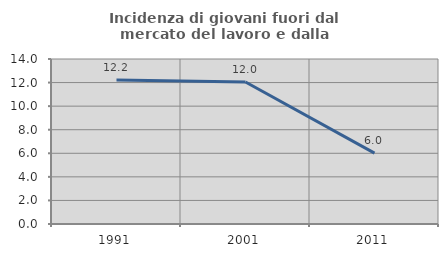
| Category | Incidenza di giovani fuori dal mercato del lavoro e dalla formazione  |
|---|---|
| 1991.0 | 12.219 |
| 2001.0 | 12.048 |
| 2011.0 | 6.009 |